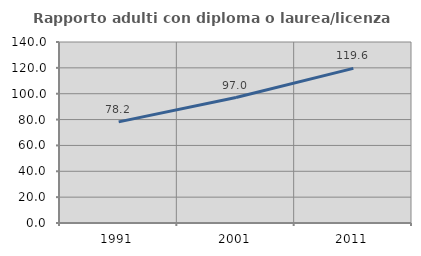
| Category | Rapporto adulti con diploma o laurea/licenza media  |
|---|---|
| 1991.0 | 78.214 |
| 2001.0 | 97.017 |
| 2011.0 | 119.597 |